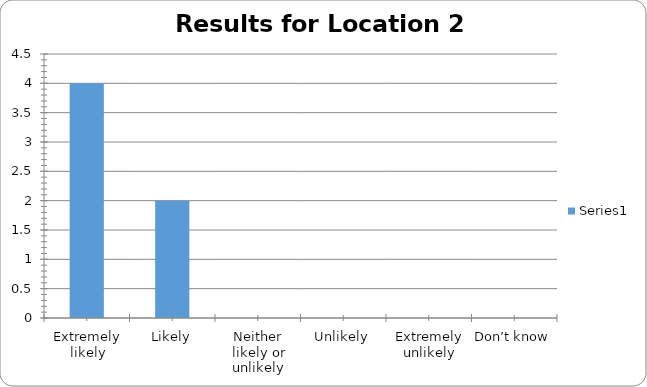
| Category | Series 0 |
|---|---|
| Extremely likely | 4 |
| Likely | 2 |
| Neither likely or unlikely | 0 |
| Unlikely | 0 |
| Extremely unlikely | 0 |
| Don’t know | 0 |